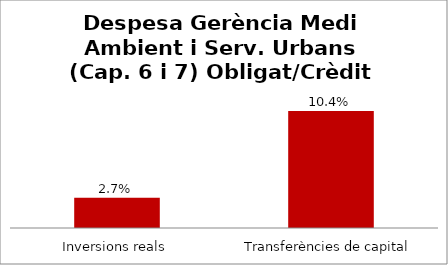
| Category | Series 0 |
|---|---|
| Inversions reals | 0.027 |
| Transferències de capital | 0.104 |